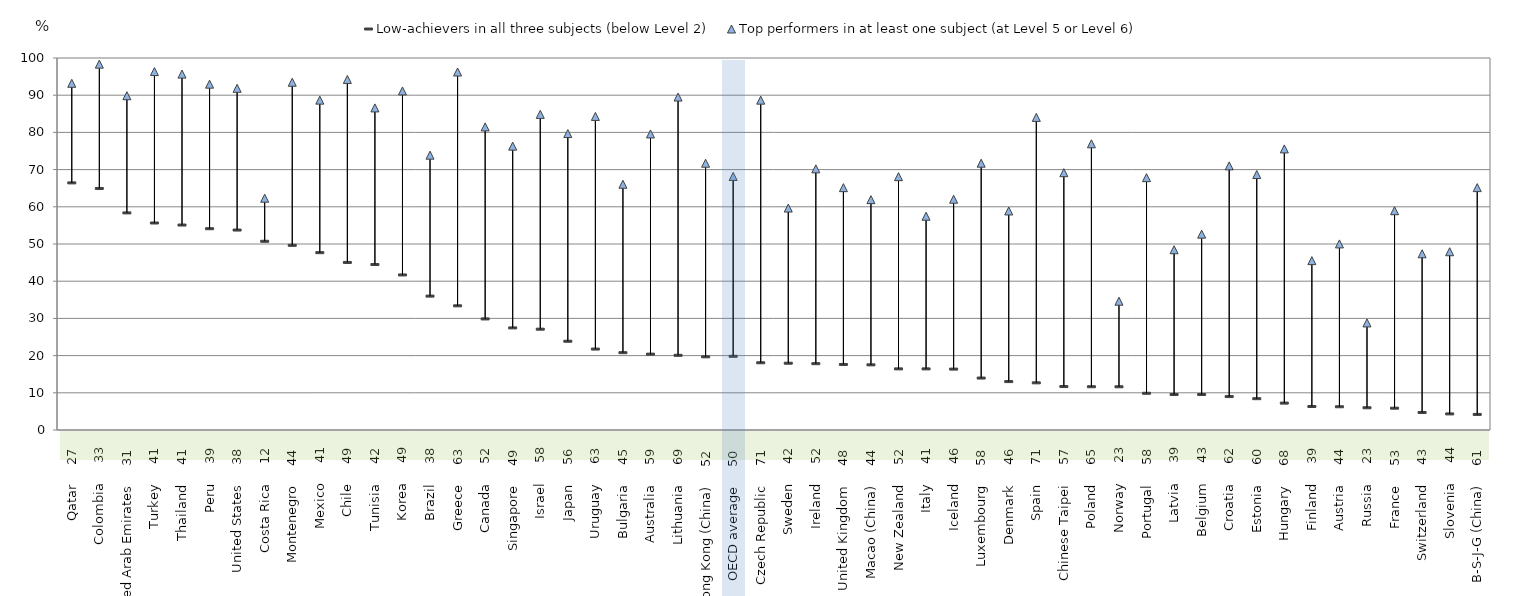
| Category | Low-achievers in all three subjects (below Level 2)  | Top performers in at least one subject (at Level 5 or Level 6) |
|---|---|---|
| Qatar     27 | 66.429 | 93.196 |
| Colombia     33 | 64.924 | 98.348 |
| United Arab Emirates     31 | 58.358 | 89.856 |
| Turkey     41 | 55.646 | 96.352 |
| Thailand     41 | 55.098 | 95.673 |
| Peru     39 | 54.108 | 92.969 |
| United States     38 | 53.755 | 91.855 |
| Costa Rica     12 | 50.735 | 62.307 |
| Montenegro     44 | 49.646 | 93.485 |
| Mexico     41 | 47.673 | 88.674 |
| Chile     49 | 45.04 | 94.235 |
| Tunisia     42 | 44.478 | 86.582 |
| Korea     49 | 41.68 | 91.15 |
| Brazil     38 | 35.993 | 73.875 |
| Greece     63 | 33.38 | 96.239 |
| Canada     52 | 29.857 | 81.48 |
| Singapore     49 | 27.446 | 76.31 |
| Israel     58 | 27.103 | 84.843 |
| Japan     56 | 23.862 | 79.689 |
| Uruguay     63 | 21.759 | 84.299 |
| Bulgaria     45 | 20.786 | 66.06 |
| Australia     59 | 20.395 | 79.586 |
| Lithuania     69 | 20.077 | 89.506 |
| Hong Kong (China)     52 | 19.673 | 71.715 |
| OECD average     50 | 19.814 | 68.162 |
| Czech Republic     71 | 18.073 | 88.668 |
| Sweden     42 | 17.952 | 59.664 |
| Ireland     52 | 17.828 | 70.198 |
| United Kingdom     48 | 17.612 | 65.143 |
| Macao (China)     44 | 17.512 | 61.921 |
| New Zealand     52 | 16.432 | 68.1 |
| Italy     41 | 16.428 | 57.465 |
| Iceland     46 | 16.369 | 62.041 |
| Luxembourg     58 | 13.963 | 71.721 |
| Denmark     46 | 13.014 | 58.882 |
| Spain     71 | 12.68 | 84.029 |
| Chinese Taipei     57 | 11.684 | 69.172 |
| Poland     65 | 11.632 | 76.937 |
| Norway     23 | 11.619 | 34.622 |
| Portugal     58 | 9.873 | 67.83 |
| Latvia     39 | 9.539 | 48.457 |
| Belgium     43 | 9.535 | 52.647 |
| Croatia     62 | 8.986 | 71.008 |
| Estonia     60 | 8.419 | 68.673 |
| Hungary     68 | 7.23 | 75.56 |
| Finland     39 | 6.314 | 45.535 |
| Austria     44 | 6.247 | 50.024 |
| Russia     23 | 5.976 | 28.788 |
| France     53 | 5.864 | 58.95 |
| Switzerland     43 | 4.708 | 47.367 |
| Slovenia     44 | 4.325 | 47.918 |
| B-S-J-G (China)     61 | 4.187 | 65.159 |